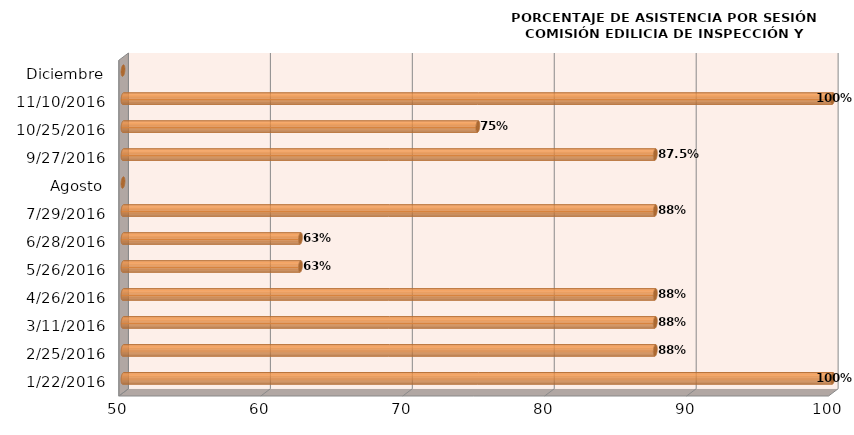
| Category | Series 0 |
|---|---|
| 22/01/2016 | 100 |
| 25/02/2016 | 87.5 |
| 11/03/2016 | 87.5 |
| 26/04/2016 | 87.5 |
| 26/05/2016 | 62.5 |
| 28/06/2016 | 62.5 |
| 29/07/2016 | 87.5 |
| Agosto | 0 |
| 27/09/2016 | 87.5 |
| 25/10/2016 | 75 |
| 10/11/2016 | 100 |
| Diciembre | 0 |